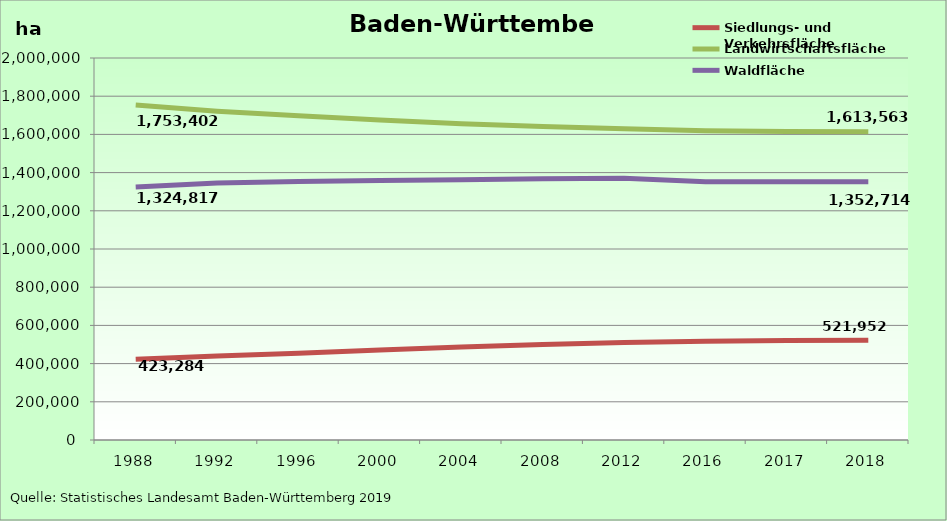
| Category | Siedlungs- und Verkehrsfläche | Landwirtschaftsfläche | Waldfläche |
|---|---|---|---|
| 1988.0 | 423284 | 1753402 | 1324817 |
| 1992.0 | 439340 | 1721385 | 1345395 |
| 1996.0 | 454294 | 1698267 | 1352933 |
| 2000.0 | 471832 | 1674917 | 1358434 |
| 2004.0 | 486992 | 1655939 | 1363025 |
| 2008.0 | 500386 | 1641968 | 1367585 |
| 2012.0 | 510143 | 1629528 | 1369993 |
| 2016.0 | 517434 | 1618933 | 1352564 |
| 2017.0 | 520301 | 1615542 | 1352514 |
| 2018.0 | 521952 | 1613563 | 1352714 |